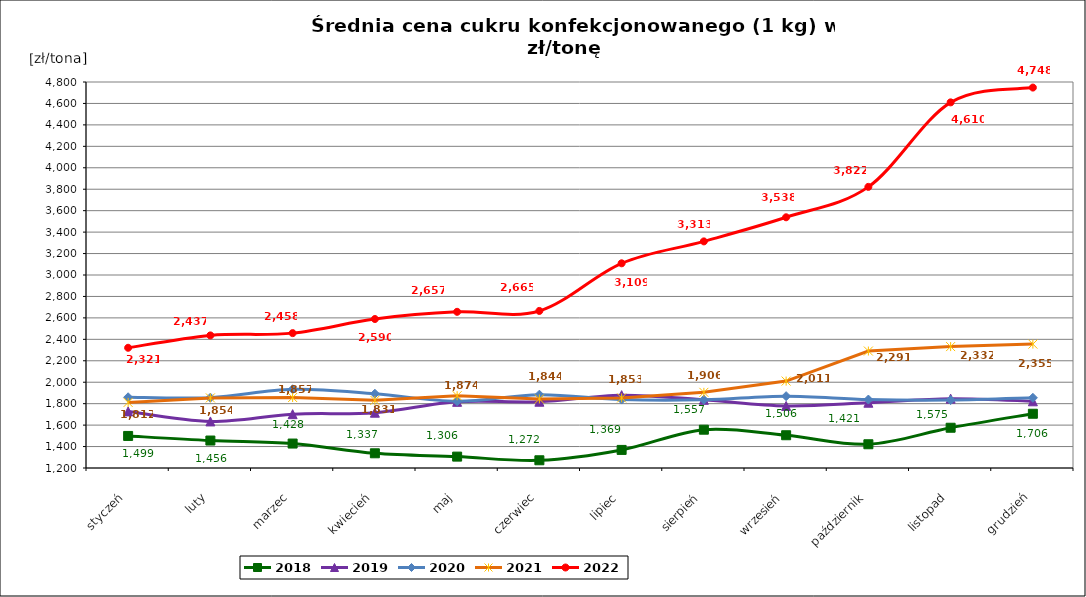
| Category | 2018 | 2019 | 2020 | 2021 | 2022 |
|---|---|---|---|---|---|
| styczeń | 1498.886 | 1727.969 | 1859.593 | 1811.782 | 2321.228 |
| luty | 1456.146 | 1634.38 | 1856.103 | 1853.617 | 2436.542 |
| marzec | 1427.994 | 1702.118 | 1934.235 | 1857.441 | 2457.887 |
| kwiecień | 1337.194 | 1715.746 | 1892.714 | 1830.988 | 2589.559 |
| maj | 1306.184 | 1817.049 | 1822.617 | 1874.181 | 2656.642 |
| czerwiec | 1272.007 | 1818.139 | 1883.791 | 1843.904 | 2664.827 |
| lipiec | 1368.668 | 1879.503 | 1838.309 | 1853.435 | 3109.075 |
| sierpień | 1557.184 | 1835.868 | 1836.22 | 1905.693 | 3313.432 |
| wrzesień | 1505.537 | 1779.059 | 1869.948 | 2010.528 | 3538.266 |
| październik | 1421.455 | 1808.715 | 1838.312 | 2290.882 | 3821.859 |
| listopad | 1575.442 | 1846.806 | 1833.149 | 2332.309 | 4610.09 |
| grudzień | 1705.916 | 1821.997 | 1854.633 | 2355.492 | 4748.066 |